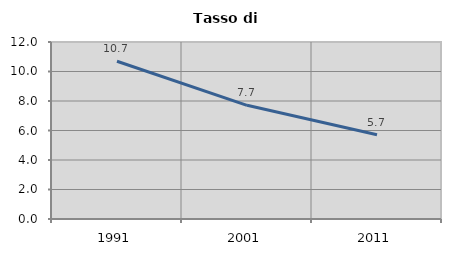
| Category | Tasso di disoccupazione   |
|---|---|
| 1991.0 | 10.694 |
| 2001.0 | 7.708 |
| 2011.0 | 5.714 |